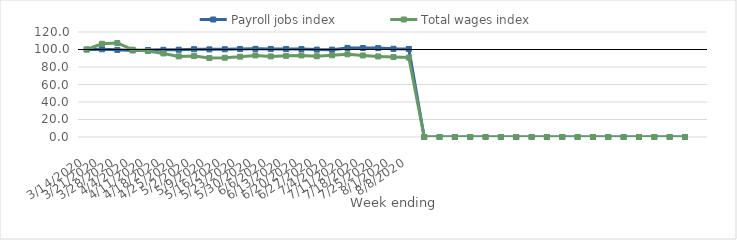
| Category | Payroll jobs index | Total wages index |
|---|---|---|
| 14/03/2020 | 100 | 100 |
| 21/03/2020 | 100.315 | 106.529 |
| 28/03/2020 | 99.589 | 107.431 |
| 04/04/2020 | 98.987 | 99.738 |
| 11/04/2020 | 99.47 | 98.221 |
| 18/04/2020 | 99.633 | 95.494 |
| 25/04/2020 | 99.782 | 92.136 |
| 02/05/2020 | 100.301 | 92.462 |
| 09/05/2020 | 100.161 | 90.241 |
| 16/05/2020 | 100.27 | 90.599 |
| 23/05/2020 | 100.553 | 91.821 |
| 30/05/2020 | 100.728 | 93.26 |
| 06/06/2020 | 100.652 | 92.137 |
| 13/06/2020 | 100.598 | 92.735 |
| 20/06/2020 | 100.515 | 93.242 |
| 27/06/2020 | 99.888 | 92.284 |
| 04/07/2020 | 99.841 | 93.41 |
| 11/07/2020 | 101.828 | 94.546 |
| 18/07/2020 | 101.662 | 93.194 |
| 25/07/2020 | 101.594 | 92.065 |
| 01/08/2020 | 100.81 | 91.322 |
| 08/08/2020 | 100.598 | 90.764 |